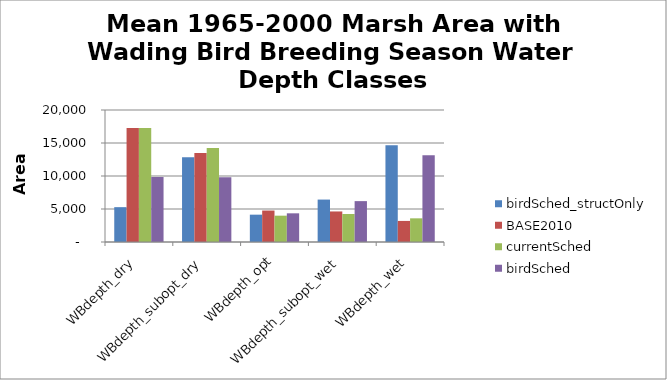
| Category | birdSched_structOnly | BASE2010 | currentSched | birdSched |
|---|---|---|---|---|
| WBdepth_dry | 5279.675 | 17288.761 | 17277.739 | 9851.261 |
| WBdepth_subopt_dry | 12856.206 | 13475.167 | 14252.428 | 9807.922 |
| WBdepth_opt | 4141.625 | 4765.178 | 3988.839 | 4345.114 |
| WBdepth_subopt_wet | 6428.025 | 4627.717 | 4244.578 | 6193.142 |
| WBdepth_wet | 14644.475 | 3193.164 | 3586.414 | 13152.567 |